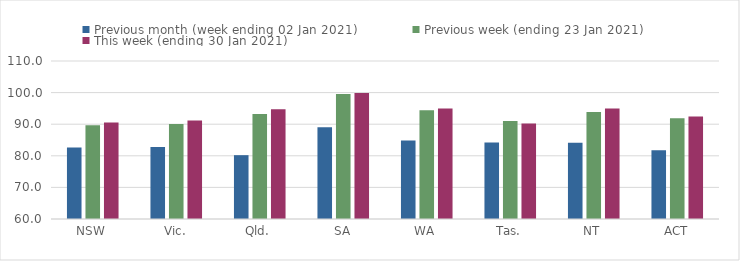
| Category | Previous month (week ending 02 Jan 2021) | Previous week (ending 23 Jan 2021) | This week (ending 30 Jan 2021) |
|---|---|---|---|
| NSW | 82.66 | 89.7 | 90.52 |
| Vic. | 82.78 | 90.03 | 91.18 |
| Qld. | 80.2 | 93.23 | 94.77 |
| SA | 89.07 | 99.53 | 99.86 |
| WA | 84.85 | 94.43 | 94.96 |
| Tas. | 84.19 | 91.03 | 90.24 |
| NT | 84.14 | 93.86 | 94.95 |
| ACT | 81.77 | 91.86 | 92.44 |